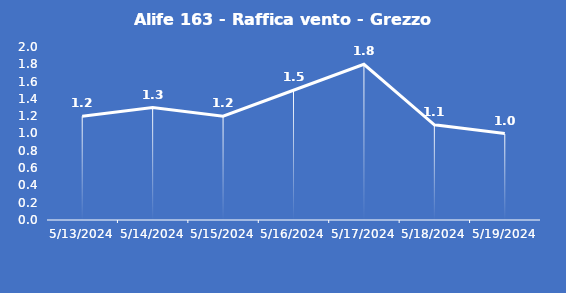
| Category | Alife 163 - Raffica vento - Grezzo (m/s) |
|---|---|
| 5/13/24 | 1.2 |
| 5/14/24 | 1.3 |
| 5/15/24 | 1.2 |
| 5/16/24 | 1.5 |
| 5/17/24 | 1.8 |
| 5/18/24 | 1.1 |
| 5/19/24 | 1 |